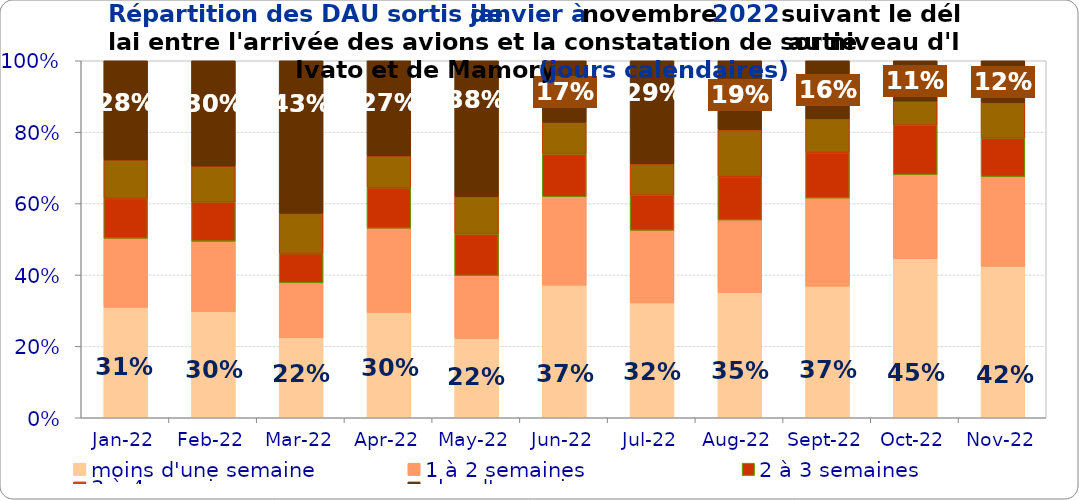
| Category | moins d'une semaine | 1 à 2 semaines | 2 à 3 semaines | 3 à 4 semaines | plus d'un mois |
|---|---|---|---|---|---|
| 2022-01-01 | 0.309 | 0.194 | 0.112 | 0.108 | 0.278 |
| 2022-02-01 | 0.297 | 0.197 | 0.109 | 0.101 | 0.295 |
| 2022-03-01 | 0.224 | 0.154 | 0.082 | 0.113 | 0.427 |
| 2022-04-01 | 0.295 | 0.236 | 0.114 | 0.089 | 0.266 |
| 2022-05-01 | 0.222 | 0.177 | 0.117 | 0.105 | 0.38 |
| 2022-06-01 | 0.371 | 0.248 | 0.12 | 0.089 | 0.172 |
| 2022-07-01 | 0.322 | 0.204 | 0.098 | 0.088 | 0.288 |
| 2022-08-01 | 0.35 | 0.204 | 0.122 | 0.132 | 0.193 |
| 2022-09-01 | 0.368 | 0.247 | 0.127 | 0.095 | 0.162 |
| 2022-10-01 | 0.445 | 0.236 | 0.138 | 0.068 | 0.113 |
| 2022-11-01 | 0.424 | 0.251 | 0.108 | 0.1 | 0.117 |